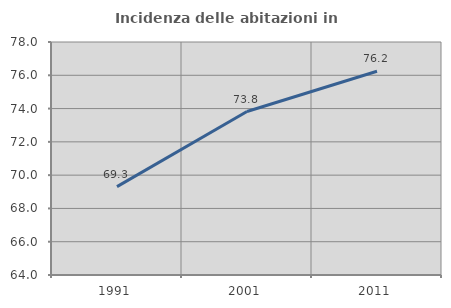
| Category | Incidenza delle abitazioni in proprietà  |
|---|---|
| 1991.0 | 69.307 |
| 2001.0 | 73.821 |
| 2011.0 | 76.245 |